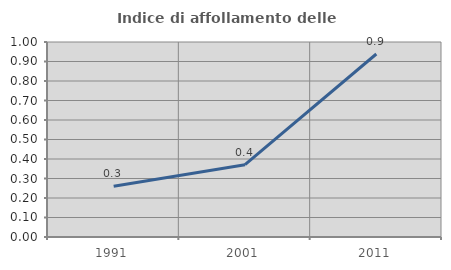
| Category | Indice di affollamento delle abitazioni  |
|---|---|
| 1991.0 | 0.26 |
| 2001.0 | 0.371 |
| 2011.0 | 0.938 |